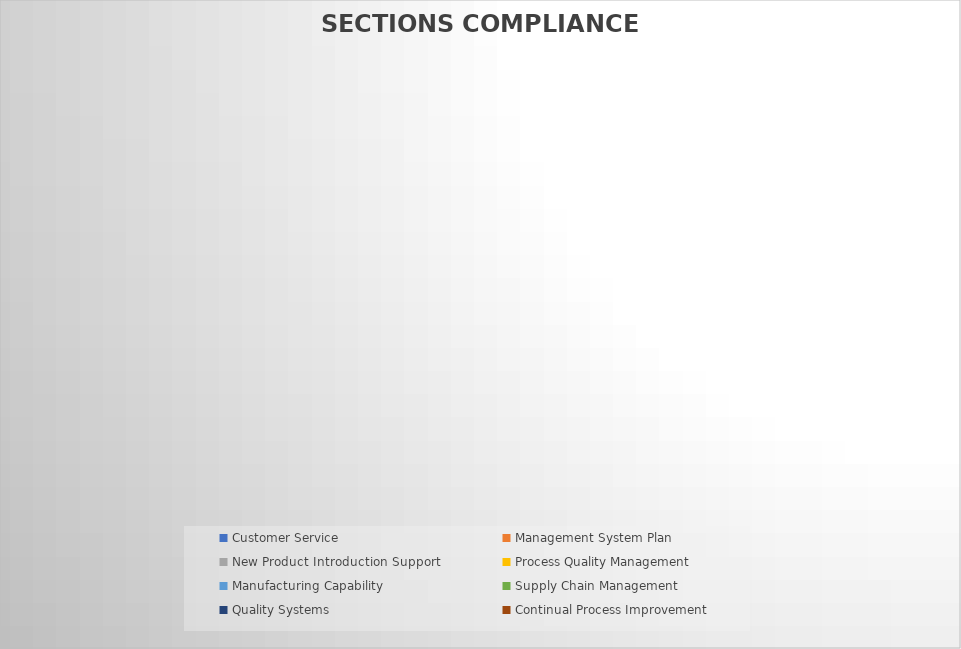
| Category | PERCENTAGE OF MAX POSSIBLE |
|---|---|
| Customer Service | 0 |
| Management System Plan | 0 |
| New Product Introduction Support | 0 |
| Process Quality Management | 0 |
| Manufacturing Capability | 0 |
| Supply Chain Management | 0 |
| Quality Systems | 0 |
| Continual Process Improvement | 0 |